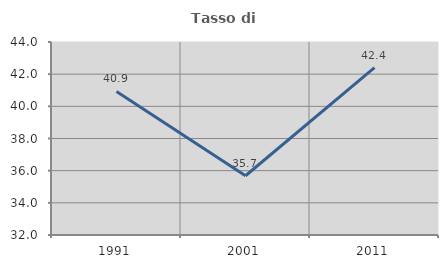
| Category | Tasso di occupazione   |
|---|---|
| 1991.0 | 40.924 |
| 2001.0 | 35.685 |
| 2011.0 | 42.402 |